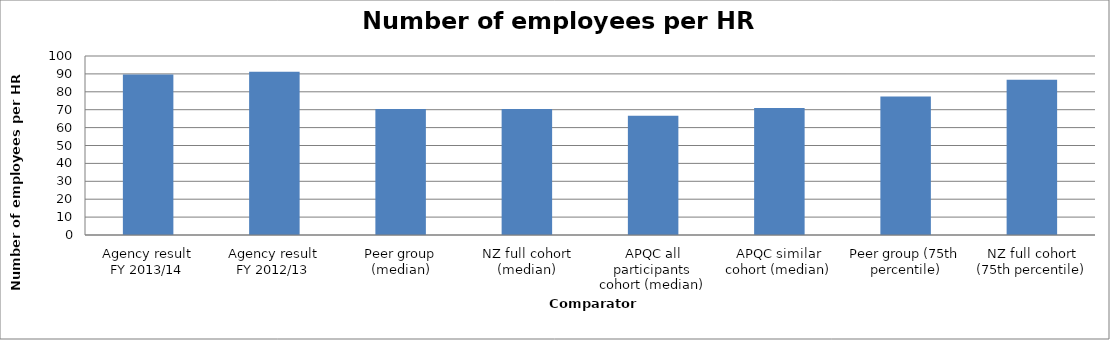
| Category | Result |
|---|---|
| Agency result
FY 2013/14 | 89.6 |
| Agency result
FY 2012/13 | 91.178 |
| Peer group (median) | 70.413 |
| NZ full cohort (median) | 70.413 |
| APQC all participants cohort (median) | 66.67 |
| APQC similar cohort (median) | 70.88 |
| Peer group (75th percentile) | 77.377 |
| NZ full cohort (75th percentile) | 86.753 |